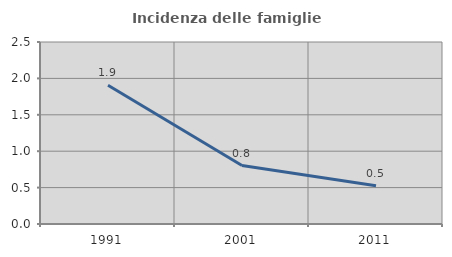
| Category | Incidenza delle famiglie numerose |
|---|---|
| 1991.0 | 1.906 |
| 2001.0 | 0.803 |
| 2011.0 | 0.526 |